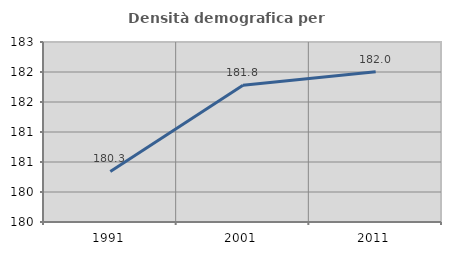
| Category | Densità demografica |
|---|---|
| 1991.0 | 180.343 |
| 2001.0 | 181.778 |
| 2011.0 | 182.005 |